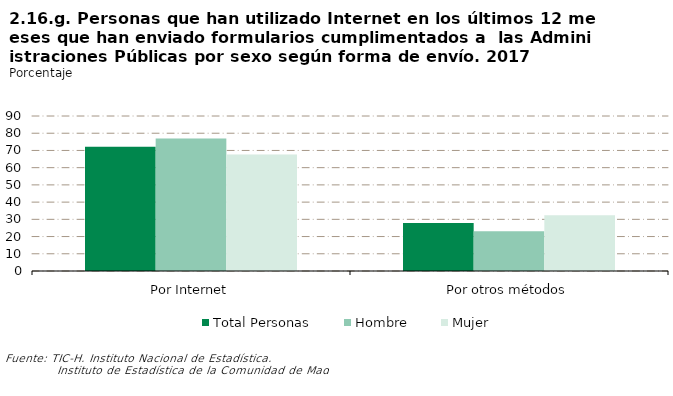
| Category | Total Personas | Hombre | Mujer |
|---|---|---|---|
| Por Internet | 72.189 | 76.945 | 67.619 |
| Por otros métodos | 27.811 | 23.055 | 32.381 |